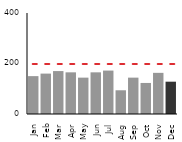
| Category | Danish |
|---|---|
| Jan | 150 |
| Feb | 160 |
| Mar | 170 |
| Apr | 165 |
| May | 144 |
| Jun | 165 |
| Jul | 172 |
| Aug | 94 |
| Sep | 144 |
| Oct | 123 |
| Nov | 163 |
| Dec | 128 |